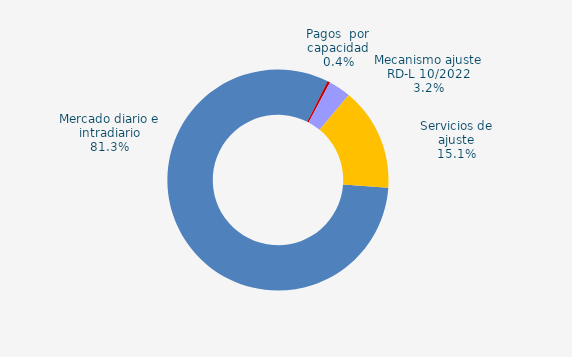
| Category | Series 0 |
|---|---|
| Mercado diario e intradiario | 73.07 |
| Pagos  por capacidad | 0.33 |
| Mecanismo ajuste RD-L 10/2022 | 2.92 |
| Servicios de ajuste | 13.55 |